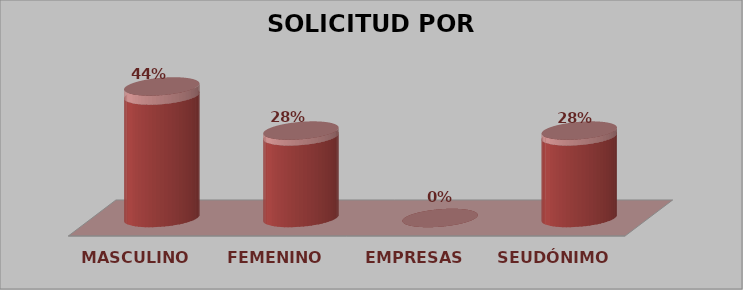
| Category | SOLICITUD POR GÉNERO | Series 1 |
|---|---|---|
| MASCULINO | 6 | 0.44 |
| FEMENINO | 4 | 0.28 |
| EMPRESAS | 0 | 0 |
| SEUDÓNIMO | 4 | 0.28 |